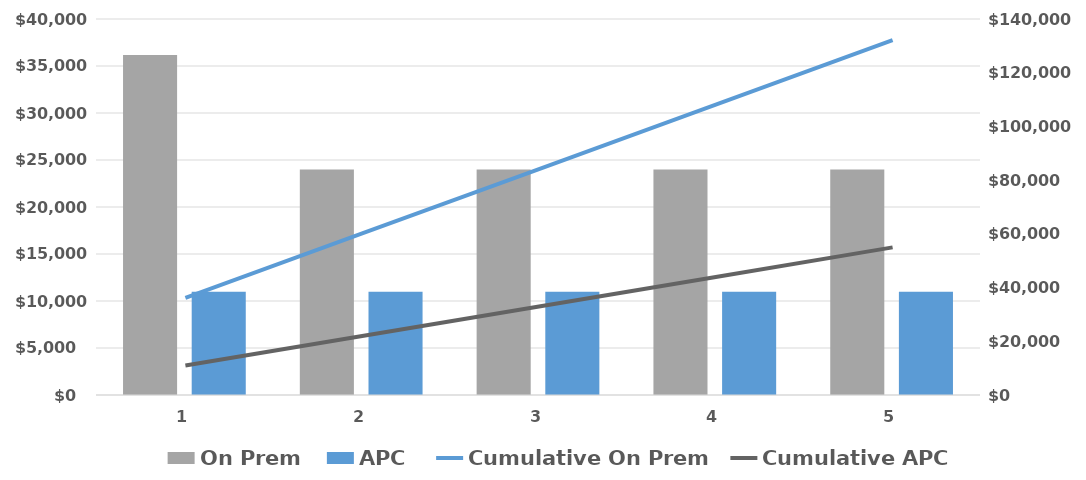
| Category | On Prem | APC |
|---|---|---|
| 0 | 36180 | 10992 |
| 1 | 23980 | 10992 |
| 2 | 23980 | 10992 |
| 3 | 23980 | 10992 |
| 4 | 23980 | 10992 |